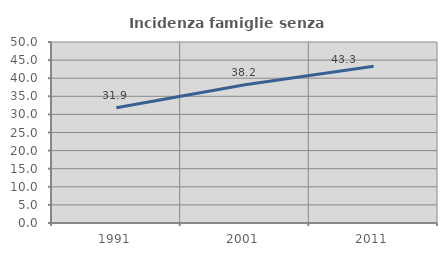
| Category | Incidenza famiglie senza nuclei |
|---|---|
| 1991.0 | 31.856 |
| 2001.0 | 38.173 |
| 2011.0 | 43.296 |